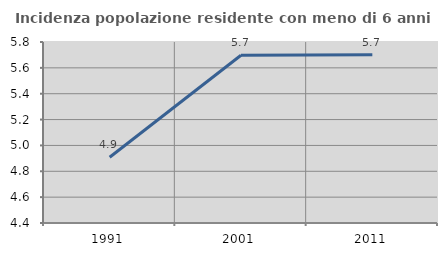
| Category | Incidenza popolazione residente con meno di 6 anni |
|---|---|
| 1991.0 | 4.908 |
| 2001.0 | 5.698 |
| 2011.0 | 5.702 |